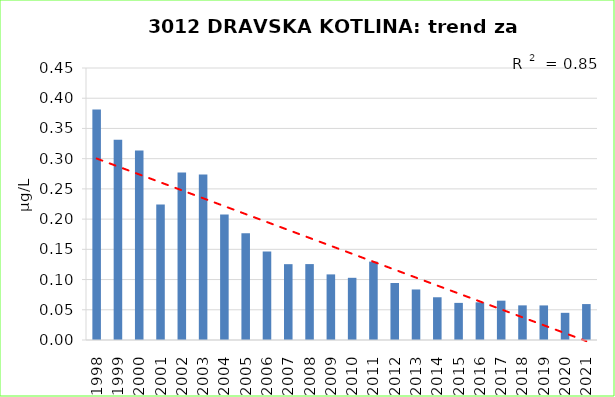
| Category | Vsota |
|---|---|
| 1998 | 0.382 |
| 1999 | 0.332 |
| 2000 | 0.314 |
| 2001 | 0.224 |
| 2002 | 0.277 |
| 2003 | 0.274 |
| 2004 | 0.208 |
| 2005 | 0.177 |
| 2006 | 0.146 |
| 2007 | 0.125 |
| 2008 | 0.126 |
| 2009 | 0.109 |
| 2010 | 0.103 |
| 2011 | 0.13 |
| 2012 | 0.094 |
| 2013 | 0.084 |
| 2014 | 0.071 |
| 2015 | 0.061 |
| 2016 | 0.062 |
| 2017 | 0.065 |
| 2018 | 0.057 |
| 2019 | 0.057 |
| 2020 | 0.045 |
| 2021 | 0.059 |